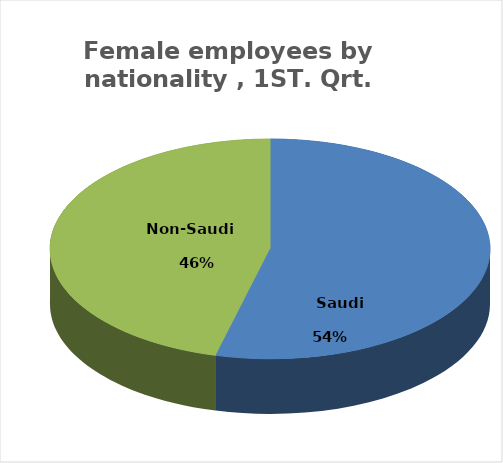
| Category | Series 0 |
|---|---|
|        Saudi      | 155996 |
|          Non-Saudi        | 133015 |